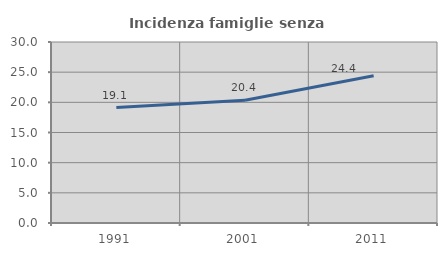
| Category | Incidenza famiglie senza nuclei |
|---|---|
| 1991.0 | 19.138 |
| 2001.0 | 20.355 |
| 2011.0 | 24.394 |